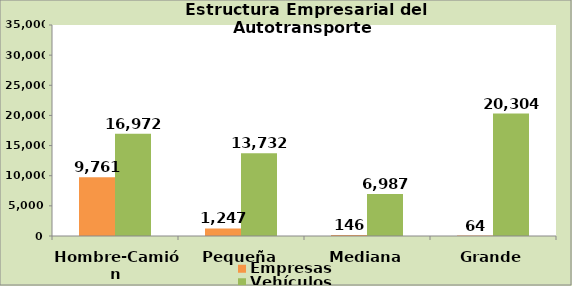
| Category | Empresas | Vehículos |
|---|---|---|
| Hombre-Camión | 9761 | 16972 |
| Pequeña | 1247 | 13732 |
| Mediana | 146 | 6987 |
| Grande | 64 | 20304 |